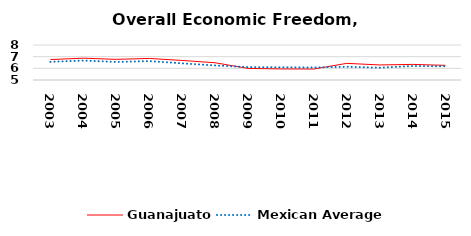
| Category | Guanajuato | Mexican Average  |
|---|---|---|
| 2003.0 | 6.753 | 6.552 |
| 2004.0 | 6.87 | 6.668 |
| 2005.0 | 6.769 | 6.546 |
| 2006.0 | 6.848 | 6.619 |
| 2007.0 | 6.676 | 6.428 |
| 2008.0 | 6.479 | 6.248 |
| 2009.0 | 5.994 | 6.106 |
| 2010.0 | 5.95 | 6.086 |
| 2011.0 | 5.939 | 6.074 |
| 2012.0 | 6.427 | 6.134 |
| 2013.0 | 6.29 | 6.054 |
| 2014.0 | 6.337 | 6.2 |
| 2015.0 | 6.255 | 6.174 |